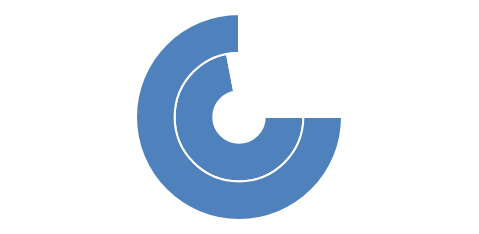
| Category | Series 1 | Series 0 |
|---|---|---|
| 0 | 0.72 | 0.75 |
| 1 | 0.28 | 0.25 |